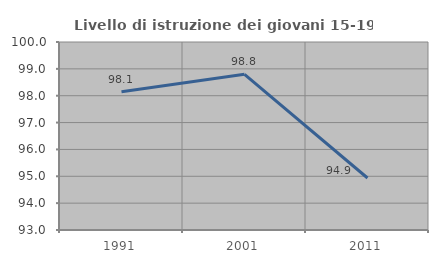
| Category | Livello di istruzione dei giovani 15-19 anni |
|---|---|
| 1991.0 | 98.148 |
| 2001.0 | 98.795 |
| 2011.0 | 94.937 |